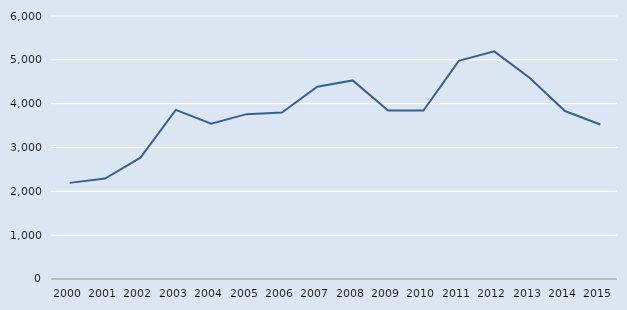
| Category | Series 0 |
|---|---|
| 2000.0 | 2193 |
| 2001.0 | 2293 |
| 2002.0 | 2767 |
| 2003.0 | 3857 |
| 2004.0 | 3542 |
| 2005.0 | 3761 |
| 2006.0 | 3796 |
| 2007.0 | 4385 |
| 2008.0 | 4531 |
| 2009.0 | 3844 |
| 2010.0 | 3845 |
| 2011.0 | 4977 |
| 2012.0 | 5193 |
| 2013.0 | 4590 |
| 2014.0 | 3832 |
| 2015.0 | 3525 |